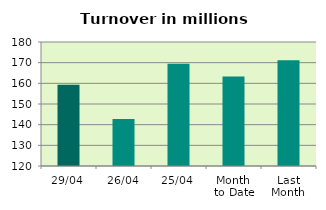
| Category | Series 0 |
|---|---|
| 29/04 | 159.358 |
| 26/04 | 142.705 |
| 25/04 | 169.509 |
| Month 
to Date | 163.307 |
| Last
Month | 171.15 |